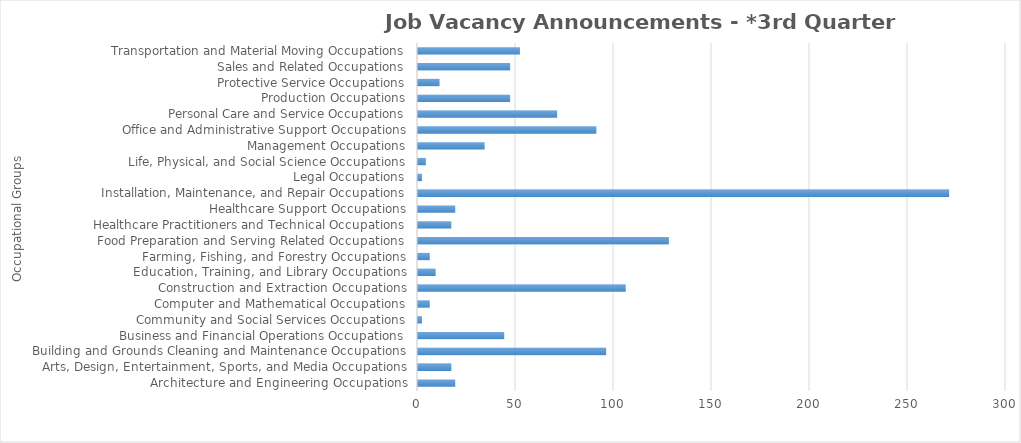
| Category | Total JVAs |
|---|---|
| Architecture and Engineering Occupations | 19 |
| Arts, Design, Entertainment, Sports, and Media Occupations | 17 |
| Building and Grounds Cleaning and Maintenance Occupations | 96 |
| Business and Financial Operations Occupations | 44 |
| Community and Social Services Occupations | 2 |
| Computer and Mathematical Occupations | 6 |
| Construction and Extraction Occupations | 106 |
| Education, Training, and Library Occupations | 9 |
| Farming, Fishing, and Forestry Occupations | 6 |
| Food Preparation and Serving Related Occupations | 128 |
| Healthcare Practitioners and Technical Occupations | 17 |
| Healthcare Support Occupations | 19 |
| Installation, Maintenance, and Repair Occupations | 271 |
| Legal Occupations | 2 |
| Life, Physical, and Social Science Occupations | 4 |
| Management Occupations | 34 |
| Office and Administrative Support Occupations | 91 |
| Personal Care and Service Occupations | 71 |
| Production Occupations | 47 |
| Protective Service Occupations | 11 |
| Sales and Related Occupations | 47 |
| Transportation and Material Moving Occupations | 52 |